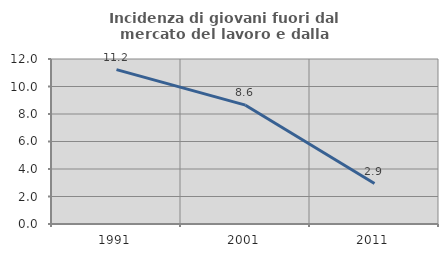
| Category | Incidenza di giovani fuori dal mercato del lavoro e dalla formazione  |
|---|---|
| 1991.0 | 11.224 |
| 2001.0 | 8.642 |
| 2011.0 | 2.941 |